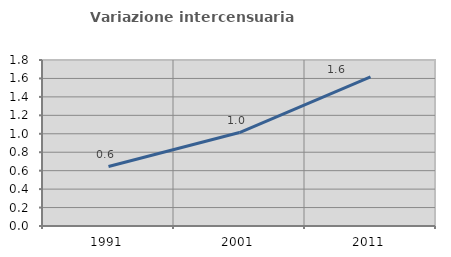
| Category | Variazione intercensuaria annua |
|---|---|
| 1991.0 | 0.645 |
| 2001.0 | 1.014 |
| 2011.0 | 1.617 |